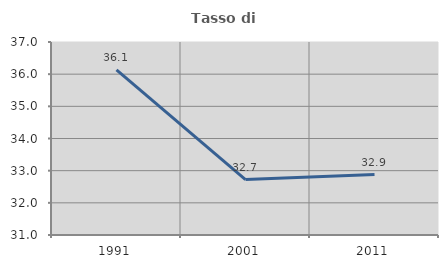
| Category | Tasso di occupazione   |
|---|---|
| 1991.0 | 36.131 |
| 2001.0 | 32.725 |
| 2011.0 | 32.88 |